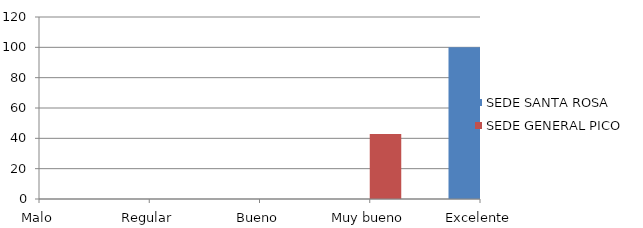
| Category | SEDE SANTA ROSA | SEDE GENERAL PICO |
|---|---|---|
| Malo | 0 | 0 |
| Regular | 0 | 0 |
| Bueno | 0 | 0 |
| Muy bueno | 0 | 42.9 |
| Excelente | 100 | 57.1 |